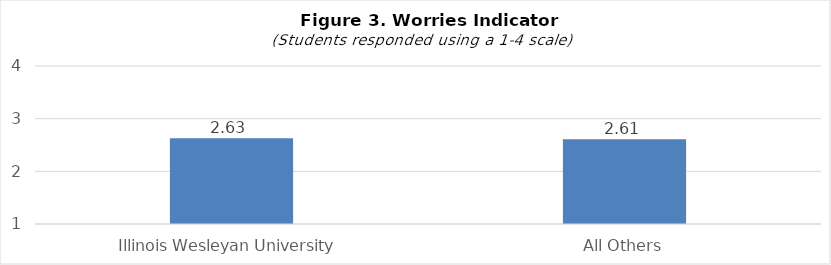
| Category | Series 0 |
|---|---|
| Illinois Wesleyan University | 2.63 |
| All Others | 2.61 |